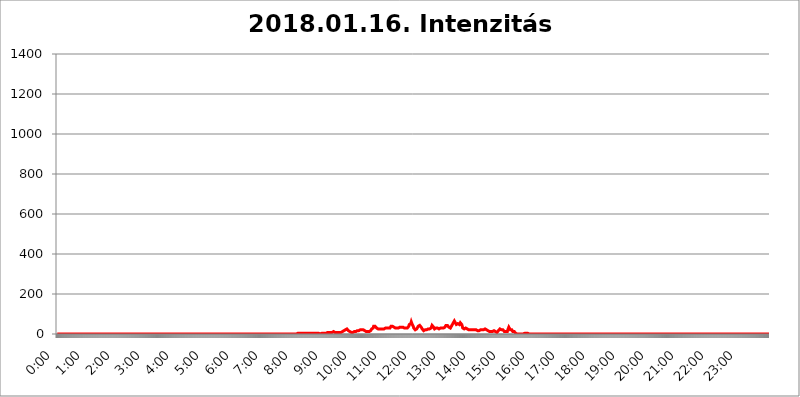
| Category | 2018.01.16. Intenzitás [W/m^2] |
|---|---|
| 0.0 | 0 |
| 0.0006944444444444445 | 0 |
| 0.001388888888888889 | 0 |
| 0.0020833333333333333 | 0 |
| 0.002777777777777778 | 0 |
| 0.003472222222222222 | 0 |
| 0.004166666666666667 | 0 |
| 0.004861111111111111 | 0 |
| 0.005555555555555556 | 0 |
| 0.0062499999999999995 | 0 |
| 0.006944444444444444 | 0 |
| 0.007638888888888889 | 0 |
| 0.008333333333333333 | 0 |
| 0.009027777777777779 | 0 |
| 0.009722222222222222 | 0 |
| 0.010416666666666666 | 0 |
| 0.011111111111111112 | 0 |
| 0.011805555555555555 | 0 |
| 0.012499999999999999 | 0 |
| 0.013194444444444444 | 0 |
| 0.013888888888888888 | 0 |
| 0.014583333333333332 | 0 |
| 0.015277777777777777 | 0 |
| 0.015972222222222224 | 0 |
| 0.016666666666666666 | 0 |
| 0.017361111111111112 | 0 |
| 0.018055555555555557 | 0 |
| 0.01875 | 0 |
| 0.019444444444444445 | 0 |
| 0.02013888888888889 | 0 |
| 0.020833333333333332 | 0 |
| 0.02152777777777778 | 0 |
| 0.022222222222222223 | 0 |
| 0.02291666666666667 | 0 |
| 0.02361111111111111 | 0 |
| 0.024305555555555556 | 0 |
| 0.024999999999999998 | 0 |
| 0.025694444444444447 | 0 |
| 0.02638888888888889 | 0 |
| 0.027083333333333334 | 0 |
| 0.027777777777777776 | 0 |
| 0.02847222222222222 | 0 |
| 0.029166666666666664 | 0 |
| 0.029861111111111113 | 0 |
| 0.030555555555555555 | 0 |
| 0.03125 | 0 |
| 0.03194444444444445 | 0 |
| 0.03263888888888889 | 0 |
| 0.03333333333333333 | 0 |
| 0.034027777777777775 | 0 |
| 0.034722222222222224 | 0 |
| 0.035416666666666666 | 0 |
| 0.036111111111111115 | 0 |
| 0.03680555555555556 | 0 |
| 0.0375 | 0 |
| 0.03819444444444444 | 0 |
| 0.03888888888888889 | 0 |
| 0.03958333333333333 | 0 |
| 0.04027777777777778 | 0 |
| 0.04097222222222222 | 0 |
| 0.041666666666666664 | 0 |
| 0.042361111111111106 | 0 |
| 0.04305555555555556 | 0 |
| 0.043750000000000004 | 0 |
| 0.044444444444444446 | 0 |
| 0.04513888888888889 | 0 |
| 0.04583333333333334 | 0 |
| 0.04652777777777778 | 0 |
| 0.04722222222222222 | 0 |
| 0.04791666666666666 | 0 |
| 0.04861111111111111 | 0 |
| 0.049305555555555554 | 0 |
| 0.049999999999999996 | 0 |
| 0.05069444444444445 | 0 |
| 0.051388888888888894 | 0 |
| 0.052083333333333336 | 0 |
| 0.05277777777777778 | 0 |
| 0.05347222222222222 | 0 |
| 0.05416666666666667 | 0 |
| 0.05486111111111111 | 0 |
| 0.05555555555555555 | 0 |
| 0.05625 | 0 |
| 0.05694444444444444 | 0 |
| 0.057638888888888885 | 0 |
| 0.05833333333333333 | 0 |
| 0.05902777777777778 | 0 |
| 0.059722222222222225 | 0 |
| 0.06041666666666667 | 0 |
| 0.061111111111111116 | 0 |
| 0.06180555555555556 | 0 |
| 0.0625 | 0 |
| 0.06319444444444444 | 0 |
| 0.06388888888888888 | 0 |
| 0.06458333333333334 | 0 |
| 0.06527777777777778 | 0 |
| 0.06597222222222222 | 0 |
| 0.06666666666666667 | 0 |
| 0.06736111111111111 | 0 |
| 0.06805555555555555 | 0 |
| 0.06874999999999999 | 0 |
| 0.06944444444444443 | 0 |
| 0.07013888888888889 | 0 |
| 0.07083333333333333 | 0 |
| 0.07152777777777779 | 0 |
| 0.07222222222222223 | 0 |
| 0.07291666666666667 | 0 |
| 0.07361111111111111 | 0 |
| 0.07430555555555556 | 0 |
| 0.075 | 0 |
| 0.07569444444444444 | 0 |
| 0.0763888888888889 | 0 |
| 0.07708333333333334 | 0 |
| 0.07777777777777778 | 0 |
| 0.07847222222222222 | 0 |
| 0.07916666666666666 | 0 |
| 0.0798611111111111 | 0 |
| 0.08055555555555556 | 0 |
| 0.08125 | 0 |
| 0.08194444444444444 | 0 |
| 0.08263888888888889 | 0 |
| 0.08333333333333333 | 0 |
| 0.08402777777777777 | 0 |
| 0.08472222222222221 | 0 |
| 0.08541666666666665 | 0 |
| 0.08611111111111112 | 0 |
| 0.08680555555555557 | 0 |
| 0.08750000000000001 | 0 |
| 0.08819444444444445 | 0 |
| 0.08888888888888889 | 0 |
| 0.08958333333333333 | 0 |
| 0.09027777777777778 | 0 |
| 0.09097222222222222 | 0 |
| 0.09166666666666667 | 0 |
| 0.09236111111111112 | 0 |
| 0.09305555555555556 | 0 |
| 0.09375 | 0 |
| 0.09444444444444444 | 0 |
| 0.09513888888888888 | 0 |
| 0.09583333333333333 | 0 |
| 0.09652777777777777 | 0 |
| 0.09722222222222222 | 0 |
| 0.09791666666666667 | 0 |
| 0.09861111111111111 | 0 |
| 0.09930555555555555 | 0 |
| 0.09999999999999999 | 0 |
| 0.10069444444444443 | 0 |
| 0.1013888888888889 | 0 |
| 0.10208333333333335 | 0 |
| 0.10277777777777779 | 0 |
| 0.10347222222222223 | 0 |
| 0.10416666666666667 | 0 |
| 0.10486111111111111 | 0 |
| 0.10555555555555556 | 0 |
| 0.10625 | 0 |
| 0.10694444444444444 | 0 |
| 0.1076388888888889 | 0 |
| 0.10833333333333334 | 0 |
| 0.10902777777777778 | 0 |
| 0.10972222222222222 | 0 |
| 0.1111111111111111 | 0 |
| 0.11180555555555556 | 0 |
| 0.11180555555555556 | 0 |
| 0.1125 | 0 |
| 0.11319444444444444 | 0 |
| 0.11388888888888889 | 0 |
| 0.11458333333333333 | 0 |
| 0.11527777777777777 | 0 |
| 0.11597222222222221 | 0 |
| 0.11666666666666665 | 0 |
| 0.1173611111111111 | 0 |
| 0.11805555555555557 | 0 |
| 0.11944444444444445 | 0 |
| 0.12013888888888889 | 0 |
| 0.12083333333333333 | 0 |
| 0.12152777777777778 | 0 |
| 0.12222222222222223 | 0 |
| 0.12291666666666667 | 0 |
| 0.12291666666666667 | 0 |
| 0.12361111111111112 | 0 |
| 0.12430555555555556 | 0 |
| 0.125 | 0 |
| 0.12569444444444444 | 0 |
| 0.12638888888888888 | 0 |
| 0.12708333333333333 | 0 |
| 0.16875 | 0 |
| 0.12847222222222224 | 0 |
| 0.12916666666666668 | 0 |
| 0.12986111111111112 | 0 |
| 0.13055555555555556 | 0 |
| 0.13125 | 0 |
| 0.13194444444444445 | 0 |
| 0.1326388888888889 | 0 |
| 0.13333333333333333 | 0 |
| 0.13402777777777777 | 0 |
| 0.13402777777777777 | 0 |
| 0.13472222222222222 | 0 |
| 0.13541666666666666 | 0 |
| 0.1361111111111111 | 0 |
| 0.13749999999999998 | 0 |
| 0.13819444444444443 | 0 |
| 0.1388888888888889 | 0 |
| 0.13958333333333334 | 0 |
| 0.14027777777777778 | 0 |
| 0.14097222222222222 | 0 |
| 0.14166666666666666 | 0 |
| 0.1423611111111111 | 0 |
| 0.14305555555555557 | 0 |
| 0.14375000000000002 | 0 |
| 0.14444444444444446 | 0 |
| 0.1451388888888889 | 0 |
| 0.1451388888888889 | 0 |
| 0.14652777777777778 | 0 |
| 0.14722222222222223 | 0 |
| 0.14791666666666667 | 0 |
| 0.1486111111111111 | 0 |
| 0.14930555555555555 | 0 |
| 0.15 | 0 |
| 0.15069444444444444 | 0 |
| 0.15138888888888888 | 0 |
| 0.15208333333333332 | 0 |
| 0.15277777777777776 | 0 |
| 0.15347222222222223 | 0 |
| 0.15416666666666667 | 0 |
| 0.15486111111111112 | 0 |
| 0.15555555555555556 | 0 |
| 0.15625 | 0 |
| 0.15694444444444444 | 0 |
| 0.15763888888888888 | 0 |
| 0.15833333333333333 | 0 |
| 0.15902777777777777 | 0 |
| 0.15972222222222224 | 0 |
| 0.16041666666666668 | 0 |
| 0.16111111111111112 | 0 |
| 0.16180555555555556 | 0 |
| 0.1625 | 0 |
| 0.16319444444444445 | 0 |
| 0.1638888888888889 | 0 |
| 0.16458333333333333 | 0 |
| 0.16527777777777777 | 0 |
| 0.16597222222222222 | 0 |
| 0.16666666666666666 | 0 |
| 0.1673611111111111 | 0 |
| 0.16805555555555554 | 0 |
| 0.16874999999999998 | 0 |
| 0.16944444444444443 | 0 |
| 0.17013888888888887 | 0 |
| 0.1708333333333333 | 0 |
| 0.17152777777777775 | 0 |
| 0.17222222222222225 | 0 |
| 0.1729166666666667 | 0 |
| 0.17361111111111113 | 0 |
| 0.17430555555555557 | 0 |
| 0.17500000000000002 | 0 |
| 0.17569444444444446 | 0 |
| 0.1763888888888889 | 0 |
| 0.17708333333333334 | 0 |
| 0.17777777777777778 | 0 |
| 0.17847222222222223 | 0 |
| 0.17916666666666667 | 0 |
| 0.1798611111111111 | 0 |
| 0.18055555555555555 | 0 |
| 0.18125 | 0 |
| 0.18194444444444444 | 0 |
| 0.1826388888888889 | 0 |
| 0.18333333333333335 | 0 |
| 0.1840277777777778 | 0 |
| 0.18472222222222223 | 0 |
| 0.18541666666666667 | 0 |
| 0.18611111111111112 | 0 |
| 0.18680555555555556 | 0 |
| 0.1875 | 0 |
| 0.18819444444444444 | 0 |
| 0.18888888888888888 | 0 |
| 0.18958333333333333 | 0 |
| 0.19027777777777777 | 0 |
| 0.1909722222222222 | 0 |
| 0.19166666666666665 | 0 |
| 0.19236111111111112 | 0 |
| 0.19305555555555554 | 0 |
| 0.19375 | 0 |
| 0.19444444444444445 | 0 |
| 0.1951388888888889 | 0 |
| 0.19583333333333333 | 0 |
| 0.19652777777777777 | 0 |
| 0.19722222222222222 | 0 |
| 0.19791666666666666 | 0 |
| 0.1986111111111111 | 0 |
| 0.19930555555555554 | 0 |
| 0.19999999999999998 | 0 |
| 0.20069444444444443 | 0 |
| 0.20138888888888887 | 0 |
| 0.2020833333333333 | 0 |
| 0.2027777777777778 | 0 |
| 0.2034722222222222 | 0 |
| 0.2041666666666667 | 0 |
| 0.20486111111111113 | 0 |
| 0.20555555555555557 | 0 |
| 0.20625000000000002 | 0 |
| 0.20694444444444446 | 0 |
| 0.2076388888888889 | 0 |
| 0.20833333333333334 | 0 |
| 0.20902777777777778 | 0 |
| 0.20972222222222223 | 0 |
| 0.21041666666666667 | 0 |
| 0.2111111111111111 | 0 |
| 0.21180555555555555 | 0 |
| 0.2125 | 0 |
| 0.21319444444444444 | 0 |
| 0.2138888888888889 | 0 |
| 0.21458333333333335 | 0 |
| 0.2152777777777778 | 0 |
| 0.21597222222222223 | 0 |
| 0.21666666666666667 | 0 |
| 0.21736111111111112 | 0 |
| 0.21805555555555556 | 0 |
| 0.21875 | 0 |
| 0.21944444444444444 | 0 |
| 0.22013888888888888 | 0 |
| 0.22083333333333333 | 0 |
| 0.22152777777777777 | 0 |
| 0.2222222222222222 | 0 |
| 0.22291666666666665 | 0 |
| 0.2236111111111111 | 0 |
| 0.22430555555555556 | 0 |
| 0.225 | 0 |
| 0.22569444444444445 | 0 |
| 0.2263888888888889 | 0 |
| 0.22708333333333333 | 0 |
| 0.22777777777777777 | 0 |
| 0.22847222222222222 | 0 |
| 0.22916666666666666 | 0 |
| 0.2298611111111111 | 0 |
| 0.23055555555555554 | 0 |
| 0.23124999999999998 | 0 |
| 0.23194444444444443 | 0 |
| 0.23263888888888887 | 0 |
| 0.2333333333333333 | 0 |
| 0.2340277777777778 | 0 |
| 0.2347222222222222 | 0 |
| 0.2354166666666667 | 0 |
| 0.23611111111111113 | 0 |
| 0.23680555555555557 | 0 |
| 0.23750000000000002 | 0 |
| 0.23819444444444446 | 0 |
| 0.2388888888888889 | 0 |
| 0.23958333333333334 | 0 |
| 0.24027777777777778 | 0 |
| 0.24097222222222223 | 0 |
| 0.24166666666666667 | 0 |
| 0.2423611111111111 | 0 |
| 0.24305555555555555 | 0 |
| 0.24375 | 0 |
| 0.24444444444444446 | 0 |
| 0.24513888888888888 | 0 |
| 0.24583333333333335 | 0 |
| 0.2465277777777778 | 0 |
| 0.24722222222222223 | 0 |
| 0.24791666666666667 | 0 |
| 0.24861111111111112 | 0 |
| 0.24930555555555556 | 0 |
| 0.25 | 0 |
| 0.25069444444444444 | 0 |
| 0.2513888888888889 | 0 |
| 0.2520833333333333 | 0 |
| 0.25277777777777777 | 0 |
| 0.2534722222222222 | 0 |
| 0.25416666666666665 | 0 |
| 0.2548611111111111 | 0 |
| 0.2555555555555556 | 0 |
| 0.25625000000000003 | 0 |
| 0.2569444444444445 | 0 |
| 0.2576388888888889 | 0 |
| 0.25833333333333336 | 0 |
| 0.2590277777777778 | 0 |
| 0.25972222222222224 | 0 |
| 0.2604166666666667 | 0 |
| 0.2611111111111111 | 0 |
| 0.26180555555555557 | 0 |
| 0.2625 | 0 |
| 0.26319444444444445 | 0 |
| 0.2638888888888889 | 0 |
| 0.26458333333333334 | 0 |
| 0.2652777777777778 | 0 |
| 0.2659722222222222 | 0 |
| 0.26666666666666666 | 0 |
| 0.2673611111111111 | 0 |
| 0.26805555555555555 | 0 |
| 0.26875 | 0 |
| 0.26944444444444443 | 0 |
| 0.2701388888888889 | 0 |
| 0.2708333333333333 | 0 |
| 0.27152777777777776 | 0 |
| 0.2722222222222222 | 0 |
| 0.27291666666666664 | 0 |
| 0.2736111111111111 | 0 |
| 0.2743055555555555 | 0 |
| 0.27499999999999997 | 0 |
| 0.27569444444444446 | 0 |
| 0.27638888888888885 | 0 |
| 0.27708333333333335 | 0 |
| 0.2777777777777778 | 0 |
| 0.27847222222222223 | 0 |
| 0.2791666666666667 | 0 |
| 0.2798611111111111 | 0 |
| 0.28055555555555556 | 0 |
| 0.28125 | 0 |
| 0.28194444444444444 | 0 |
| 0.2826388888888889 | 0 |
| 0.2833333333333333 | 0 |
| 0.28402777777777777 | 0 |
| 0.2847222222222222 | 0 |
| 0.28541666666666665 | 0 |
| 0.28611111111111115 | 0 |
| 0.28680555555555554 | 0 |
| 0.28750000000000003 | 0 |
| 0.2881944444444445 | 0 |
| 0.2888888888888889 | 0 |
| 0.28958333333333336 | 0 |
| 0.2902777777777778 | 0 |
| 0.29097222222222224 | 0 |
| 0.2916666666666667 | 0 |
| 0.2923611111111111 | 0 |
| 0.29305555555555557 | 0 |
| 0.29375 | 0 |
| 0.29444444444444445 | 0 |
| 0.2951388888888889 | 0 |
| 0.29583333333333334 | 0 |
| 0.2965277777777778 | 0 |
| 0.2972222222222222 | 0 |
| 0.29791666666666666 | 0 |
| 0.2986111111111111 | 0 |
| 0.29930555555555555 | 0 |
| 0.3 | 0 |
| 0.30069444444444443 | 0 |
| 0.3013888888888889 | 0 |
| 0.3020833333333333 | 0 |
| 0.30277777777777776 | 0 |
| 0.3034722222222222 | 0 |
| 0.30416666666666664 | 0 |
| 0.3048611111111111 | 0 |
| 0.3055555555555555 | 0 |
| 0.30624999999999997 | 0 |
| 0.3069444444444444 | 0 |
| 0.3076388888888889 | 0 |
| 0.30833333333333335 | 0 |
| 0.3090277777777778 | 0 |
| 0.30972222222222223 | 0 |
| 0.3104166666666667 | 0 |
| 0.3111111111111111 | 0 |
| 0.31180555555555556 | 0 |
| 0.3125 | 0 |
| 0.31319444444444444 | 0 |
| 0.3138888888888889 | 0 |
| 0.3145833333333333 | 0 |
| 0.31527777777777777 | 0 |
| 0.3159722222222222 | 0 |
| 0.31666666666666665 | 0 |
| 0.31736111111111115 | 0 |
| 0.31805555555555554 | 0 |
| 0.31875000000000003 | 0 |
| 0.3194444444444445 | 0 |
| 0.3201388888888889 | 0 |
| 0.32083333333333336 | 0 |
| 0.3215277777777778 | 0 |
| 0.32222222222222224 | 0 |
| 0.3229166666666667 | 0 |
| 0.3236111111111111 | 0 |
| 0.32430555555555557 | 0 |
| 0.325 | 0 |
| 0.32569444444444445 | 0 |
| 0.3263888888888889 | 0 |
| 0.32708333333333334 | 0 |
| 0.3277777777777778 | 0 |
| 0.3284722222222222 | 0 |
| 0.32916666666666666 | 0 |
| 0.3298611111111111 | 0 |
| 0.33055555555555555 | 0 |
| 0.33125 | 0 |
| 0.33194444444444443 | 0 |
| 0.3326388888888889 | 0 |
| 0.3333333333333333 | 0 |
| 0.3340277777777778 | 0 |
| 0.3347222222222222 | 0 |
| 0.3354166666666667 | 0 |
| 0.3361111111111111 | 3.525 |
| 0.3368055555555556 | 3.525 |
| 0.33749999999999997 | 3.525 |
| 0.33819444444444446 | 3.525 |
| 0.33888888888888885 | 3.525 |
| 0.33958333333333335 | 3.525 |
| 0.34027777777777773 | 3.525 |
| 0.34097222222222223 | 3.525 |
| 0.3416666666666666 | 3.525 |
| 0.3423611111111111 | 3.525 |
| 0.3430555555555555 | 3.525 |
| 0.34375 | 3.525 |
| 0.3444444444444445 | 3.525 |
| 0.3451388888888889 | 3.525 |
| 0.3458333333333334 | 3.525 |
| 0.34652777777777777 | 3.525 |
| 0.34722222222222227 | 3.525 |
| 0.34791666666666665 | 3.525 |
| 0.34861111111111115 | 3.525 |
| 0.34930555555555554 | 3.525 |
| 0.35000000000000003 | 3.525 |
| 0.3506944444444444 | 3.525 |
| 0.3513888888888889 | 3.525 |
| 0.3520833333333333 | 3.525 |
| 0.3527777777777778 | 3.525 |
| 0.3534722222222222 | 3.525 |
| 0.3541666666666667 | 3.525 |
| 0.3548611111111111 | 3.525 |
| 0.35555555555555557 | 3.525 |
| 0.35625 | 3.525 |
| 0.35694444444444445 | 3.525 |
| 0.3576388888888889 | 3.525 |
| 0.35833333333333334 | 3.525 |
| 0.3590277777777778 | 7.887 |
| 0.3597222222222222 | 7.887 |
| 0.36041666666666666 | 3.525 |
| 0.3611111111111111 | 7.887 |
| 0.36180555555555555 | 3.525 |
| 0.3625 | 3.525 |
| 0.36319444444444443 | 3.525 |
| 0.3638888888888889 | 3.525 |
| 0.3645833333333333 | 3.525 |
| 0.3652777777777778 | 3.525 |
| 0.3659722222222222 | 3.525 |
| 0.3666666666666667 | 3.525 |
| 0.3673611111111111 | 3.525 |
| 0.3680555555555556 | 3.525 |
| 0.36874999999999997 | 0 |
| 0.36944444444444446 | 3.525 |
| 0.37013888888888885 | 3.525 |
| 0.37083333333333335 | 3.525 |
| 0.37152777777777773 | 3.525 |
| 0.37222222222222223 | 3.525 |
| 0.3729166666666666 | 3.525 |
| 0.3736111111111111 | 3.525 |
| 0.3743055555555555 | 3.525 |
| 0.375 | 3.525 |
| 0.3756944444444445 | 3.525 |
| 0.3763888888888889 | 3.525 |
| 0.3770833333333334 | 3.525 |
| 0.37777777777777777 | 3.525 |
| 0.37847222222222227 | 3.525 |
| 0.37916666666666665 | 7.887 |
| 0.37986111111111115 | 7.887 |
| 0.38055555555555554 | 7.887 |
| 0.38125000000000003 | 7.887 |
| 0.3819444444444444 | 7.887 |
| 0.3826388888888889 | 7.887 |
| 0.3833333333333333 | 7.887 |
| 0.3840277777777778 | 7.887 |
| 0.3847222222222222 | 7.887 |
| 0.3854166666666667 | 7.887 |
| 0.3861111111111111 | 12.257 |
| 0.38680555555555557 | 12.257 |
| 0.3875 | 12.257 |
| 0.38819444444444445 | 12.257 |
| 0.3888888888888889 | 7.887 |
| 0.38958333333333334 | 7.887 |
| 0.3902777777777778 | 12.257 |
| 0.3909722222222222 | 12.257 |
| 0.39166666666666666 | 7.887 |
| 0.3923611111111111 | 7.887 |
| 0.39305555555555555 | 7.887 |
| 0.39375 | 7.887 |
| 0.39444444444444443 | 7.887 |
| 0.3951388888888889 | 7.887 |
| 0.3958333333333333 | 7.887 |
| 0.3965277777777778 | 7.887 |
| 0.3972222222222222 | 7.887 |
| 0.3979166666666667 | 7.887 |
| 0.3986111111111111 | 7.887 |
| 0.3993055555555556 | 7.887 |
| 0.39999999999999997 | 12.257 |
| 0.40069444444444446 | 12.257 |
| 0.40138888888888885 | 12.257 |
| 0.40208333333333335 | 16.636 |
| 0.40277777777777773 | 21.024 |
| 0.40347222222222223 | 21.024 |
| 0.4041666666666666 | 21.024 |
| 0.4048611111111111 | 25.419 |
| 0.4055555555555555 | 25.419 |
| 0.40625 | 25.419 |
| 0.4069444444444445 | 21.024 |
| 0.4076388888888889 | 21.024 |
| 0.4083333333333334 | 16.636 |
| 0.40902777777777777 | 12.257 |
| 0.40972222222222227 | 12.257 |
| 0.41041666666666665 | 12.257 |
| 0.41111111111111115 | 12.257 |
| 0.41180555555555554 | 7.887 |
| 0.41250000000000003 | 7.887 |
| 0.4131944444444444 | 7.887 |
| 0.4138888888888889 | 7.887 |
| 0.4145833333333333 | 7.887 |
| 0.4152777777777778 | 12.257 |
| 0.4159722222222222 | 12.257 |
| 0.4166666666666667 | 12.257 |
| 0.4173611111111111 | 12.257 |
| 0.41805555555555557 | 12.257 |
| 0.41875 | 12.257 |
| 0.41944444444444445 | 12.257 |
| 0.4201388888888889 | 12.257 |
| 0.42083333333333334 | 16.636 |
| 0.4215277777777778 | 16.636 |
| 0.4222222222222222 | 16.636 |
| 0.42291666666666666 | 16.636 |
| 0.4236111111111111 | 16.636 |
| 0.42430555555555555 | 21.024 |
| 0.425 | 21.024 |
| 0.42569444444444443 | 21.024 |
| 0.4263888888888889 | 21.024 |
| 0.4270833333333333 | 21.024 |
| 0.4277777777777778 | 21.024 |
| 0.4284722222222222 | 21.024 |
| 0.4291666666666667 | 21.024 |
| 0.4298611111111111 | 21.024 |
| 0.4305555555555556 | 21.024 |
| 0.43124999999999997 | 16.636 |
| 0.43194444444444446 | 16.636 |
| 0.43263888888888885 | 12.257 |
| 0.43333333333333335 | 12.257 |
| 0.43402777777777773 | 12.257 |
| 0.43472222222222223 | 12.257 |
| 0.4354166666666666 | 12.257 |
| 0.4361111111111111 | 12.257 |
| 0.4368055555555555 | 12.257 |
| 0.4375 | 12.257 |
| 0.4381944444444445 | 12.257 |
| 0.4388888888888889 | 12.257 |
| 0.4395833333333334 | 16.636 |
| 0.44027777777777777 | 21.024 |
| 0.44097222222222227 | 25.419 |
| 0.44166666666666665 | 29.823 |
| 0.44236111111111115 | 29.823 |
| 0.44305555555555554 | 29.823 |
| 0.44375000000000003 | 38.653 |
| 0.4444444444444444 | 43.079 |
| 0.4451388888888889 | 43.079 |
| 0.4458333333333333 | 38.653 |
| 0.4465277777777778 | 34.234 |
| 0.4472222222222222 | 34.234 |
| 0.4479166666666667 | 29.823 |
| 0.4486111111111111 | 29.823 |
| 0.44930555555555557 | 29.823 |
| 0.45 | 25.419 |
| 0.45069444444444445 | 25.419 |
| 0.4513888888888889 | 25.419 |
| 0.45208333333333334 | 25.419 |
| 0.4527777777777778 | 25.419 |
| 0.4534722222222222 | 25.419 |
| 0.45416666666666666 | 25.419 |
| 0.4548611111111111 | 25.419 |
| 0.45555555555555555 | 21.024 |
| 0.45625 | 25.419 |
| 0.45694444444444443 | 25.419 |
| 0.4576388888888889 | 25.419 |
| 0.4583333333333333 | 25.419 |
| 0.4590277777777778 | 25.419 |
| 0.4597222222222222 | 25.419 |
| 0.4604166666666667 | 29.823 |
| 0.4611111111111111 | 29.823 |
| 0.4618055555555556 | 29.823 |
| 0.46249999999999997 | 29.823 |
| 0.46319444444444446 | 29.823 |
| 0.46388888888888885 | 29.823 |
| 0.46458333333333335 | 29.823 |
| 0.46527777777777773 | 29.823 |
| 0.46597222222222223 | 29.823 |
| 0.4666666666666666 | 29.823 |
| 0.4673611111111111 | 34.234 |
| 0.4680555555555555 | 38.653 |
| 0.46875 | 34.234 |
| 0.4694444444444445 | 34.234 |
| 0.4701388888888889 | 38.653 |
| 0.4708333333333334 | 34.234 |
| 0.47152777777777777 | 34.234 |
| 0.47222222222222227 | 34.234 |
| 0.47291666666666665 | 34.234 |
| 0.47361111111111115 | 29.823 |
| 0.47430555555555554 | 29.823 |
| 0.47500000000000003 | 29.823 |
| 0.4756944444444444 | 29.823 |
| 0.4763888888888889 | 29.823 |
| 0.4770833333333333 | 29.823 |
| 0.4777777777777778 | 29.823 |
| 0.4784722222222222 | 29.823 |
| 0.4791666666666667 | 29.823 |
| 0.4798611111111111 | 29.823 |
| 0.48055555555555557 | 34.234 |
| 0.48125 | 34.234 |
| 0.48194444444444445 | 34.234 |
| 0.4826388888888889 | 34.234 |
| 0.48333333333333334 | 34.234 |
| 0.4840277777777778 | 34.234 |
| 0.4847222222222222 | 34.234 |
| 0.48541666666666666 | 34.234 |
| 0.4861111111111111 | 29.823 |
| 0.48680555555555555 | 29.823 |
| 0.4875 | 29.823 |
| 0.48819444444444443 | 29.823 |
| 0.4888888888888889 | 29.823 |
| 0.4895833333333333 | 29.823 |
| 0.4902777777777778 | 29.823 |
| 0.4909722222222222 | 29.823 |
| 0.4916666666666667 | 34.234 |
| 0.4923611111111111 | 34.234 |
| 0.4930555555555556 | 38.653 |
| 0.49374999999999997 | 47.511 |
| 0.49444444444444446 | 51.951 |
| 0.49513888888888885 | 43.079 |
| 0.49583333333333335 | 51.951 |
| 0.49652777777777773 | 60.85 |
| 0.49722222222222223 | 56.398 |
| 0.4979166666666666 | 47.511 |
| 0.4986111111111111 | 43.079 |
| 0.4993055555555555 | 38.653 |
| 0.5 | 29.823 |
| 0.5006944444444444 | 29.823 |
| 0.5013888888888889 | 25.419 |
| 0.5020833333333333 | 21.024 |
| 0.5027777777777778 | 21.024 |
| 0.5034722222222222 | 16.636 |
| 0.5041666666666667 | 25.419 |
| 0.5048611111111111 | 29.823 |
| 0.5055555555555555 | 29.823 |
| 0.50625 | 38.653 |
| 0.5069444444444444 | 38.653 |
| 0.5076388888888889 | 43.079 |
| 0.5083333333333333 | 43.079 |
| 0.5090277777777777 | 47.511 |
| 0.5097222222222222 | 47.511 |
| 0.5104166666666666 | 34.234 |
| 0.5111111111111112 | 29.823 |
| 0.5118055555555555 | 25.419 |
| 0.5125000000000001 | 21.024 |
| 0.5131944444444444 | 21.024 |
| 0.513888888888889 | 16.636 |
| 0.5145833333333333 | 12.257 |
| 0.5152777777777778 | 16.636 |
| 0.5159722222222222 | 21.024 |
| 0.5166666666666667 | 21.024 |
| 0.517361111111111 | 25.419 |
| 0.5180555555555556 | 21.024 |
| 0.5187499999999999 | 21.024 |
| 0.5194444444444445 | 21.024 |
| 0.5201388888888888 | 25.419 |
| 0.5208333333333334 | 25.419 |
| 0.5215277777777778 | 25.419 |
| 0.5222222222222223 | 25.419 |
| 0.5229166666666667 | 29.823 |
| 0.5236111111111111 | 29.823 |
| 0.5243055555555556 | 29.823 |
| 0.525 | 34.234 |
| 0.5256944444444445 | 43.079 |
| 0.5263888888888889 | 47.511 |
| 0.5270833333333333 | 38.653 |
| 0.5277777777777778 | 34.234 |
| 0.5284722222222222 | 29.823 |
| 0.5291666666666667 | 25.419 |
| 0.5298611111111111 | 29.823 |
| 0.5305555555555556 | 29.823 |
| 0.53125 | 29.823 |
| 0.5319444444444444 | 29.823 |
| 0.5326388888888889 | 29.823 |
| 0.5333333333333333 | 29.823 |
| 0.5340277777777778 | 29.823 |
| 0.5347222222222222 | 25.419 |
| 0.5354166666666667 | 25.419 |
| 0.5361111111111111 | 29.823 |
| 0.5368055555555555 | 29.823 |
| 0.5375 | 29.823 |
| 0.5381944444444444 | 29.823 |
| 0.5388888888888889 | 29.823 |
| 0.5395833333333333 | 29.823 |
| 0.5402777777777777 | 29.823 |
| 0.5409722222222222 | 29.823 |
| 0.5416666666666666 | 29.823 |
| 0.5423611111111112 | 29.823 |
| 0.5430555555555555 | 29.823 |
| 0.5437500000000001 | 34.234 |
| 0.5444444444444444 | 38.653 |
| 0.545138888888889 | 43.079 |
| 0.5458333333333333 | 43.079 |
| 0.5465277777777778 | 43.079 |
| 0.5472222222222222 | 43.079 |
| 0.5479166666666667 | 43.079 |
| 0.548611111111111 | 38.653 |
| 0.5493055555555556 | 34.234 |
| 0.5499999999999999 | 29.823 |
| 0.5506944444444445 | 29.823 |
| 0.5513888888888888 | 29.823 |
| 0.5520833333333334 | 34.234 |
| 0.5527777777777778 | 38.653 |
| 0.5534722222222223 | 38.653 |
| 0.5541666666666667 | 47.511 |
| 0.5548611111111111 | 47.511 |
| 0.5555555555555556 | 56.398 |
| 0.55625 | 60.85 |
| 0.5569444444444445 | 65.31 |
| 0.5576388888888889 | 60.85 |
| 0.5583333333333333 | 56.398 |
| 0.5590277777777778 | 51.951 |
| 0.5597222222222222 | 47.511 |
| 0.5604166666666667 | 43.079 |
| 0.5611111111111111 | 47.511 |
| 0.5618055555555556 | 51.951 |
| 0.5625 | 56.398 |
| 0.5631944444444444 | 51.951 |
| 0.5638888888888889 | 47.511 |
| 0.5645833333333333 | 51.951 |
| 0.5652777777777778 | 56.398 |
| 0.5659722222222222 | 51.951 |
| 0.5666666666666667 | 51.951 |
| 0.5673611111111111 | 47.511 |
| 0.5680555555555555 | 43.079 |
| 0.56875 | 29.823 |
| 0.5694444444444444 | 25.419 |
| 0.5701388888888889 | 25.419 |
| 0.5708333333333333 | 25.419 |
| 0.5715277777777777 | 25.419 |
| 0.5722222222222222 | 29.823 |
| 0.5729166666666666 | 29.823 |
| 0.5736111111111112 | 25.419 |
| 0.5743055555555555 | 25.419 |
| 0.5750000000000001 | 25.419 |
| 0.5756944444444444 | 21.024 |
| 0.576388888888889 | 21.024 |
| 0.5770833333333333 | 21.024 |
| 0.5777777777777778 | 21.024 |
| 0.5784722222222222 | 21.024 |
| 0.5791666666666667 | 21.024 |
| 0.579861111111111 | 21.024 |
| 0.5805555555555556 | 21.024 |
| 0.5812499999999999 | 21.024 |
| 0.5819444444444445 | 21.024 |
| 0.5826388888888888 | 21.024 |
| 0.5833333333333334 | 21.024 |
| 0.5840277777777778 | 21.024 |
| 0.5847222222222223 | 21.024 |
| 0.5854166666666667 | 21.024 |
| 0.5861111111111111 | 21.024 |
| 0.5868055555555556 | 21.024 |
| 0.5875 | 21.024 |
| 0.5881944444444445 | 21.024 |
| 0.5888888888888889 | 16.636 |
| 0.5895833333333333 | 16.636 |
| 0.5902777777777778 | 16.636 |
| 0.5909722222222222 | 16.636 |
| 0.5916666666666667 | 16.636 |
| 0.5923611111111111 | 16.636 |
| 0.5930555555555556 | 21.024 |
| 0.59375 | 21.024 |
| 0.5944444444444444 | 21.024 |
| 0.5951388888888889 | 25.419 |
| 0.5958333333333333 | 21.024 |
| 0.5965277777777778 | 25.419 |
| 0.5972222222222222 | 21.024 |
| 0.5979166666666667 | 21.024 |
| 0.5986111111111111 | 21.024 |
| 0.5993055555555555 | 21.024 |
| 0.6 | 25.419 |
| 0.6006944444444444 | 21.024 |
| 0.6013888888888889 | 21.024 |
| 0.6020833333333333 | 21.024 |
| 0.6027777777777777 | 16.636 |
| 0.6034722222222222 | 16.636 |
| 0.6041666666666666 | 16.636 |
| 0.6048611111111112 | 12.257 |
| 0.6055555555555555 | 12.257 |
| 0.6062500000000001 | 12.257 |
| 0.6069444444444444 | 12.257 |
| 0.607638888888889 | 12.257 |
| 0.6083333333333333 | 12.257 |
| 0.6090277777777778 | 12.257 |
| 0.6097222222222222 | 12.257 |
| 0.6104166666666667 | 12.257 |
| 0.611111111111111 | 16.636 |
| 0.6118055555555556 | 16.636 |
| 0.6124999999999999 | 16.636 |
| 0.6131944444444445 | 12.257 |
| 0.6138888888888888 | 12.257 |
| 0.6145833333333334 | 12.257 |
| 0.6152777777777778 | 7.887 |
| 0.6159722222222223 | 7.887 |
| 0.6166666666666667 | 7.887 |
| 0.6173611111111111 | 12.257 |
| 0.6180555555555556 | 12.257 |
| 0.61875 | 16.636 |
| 0.6194444444444445 | 21.024 |
| 0.6201388888888889 | 21.024 |
| 0.6208333333333333 | 25.419 |
| 0.6215277777777778 | 25.419 |
| 0.6222222222222222 | 21.024 |
| 0.6229166666666667 | 21.024 |
| 0.6236111111111111 | 21.024 |
| 0.6243055555555556 | 21.024 |
| 0.625 | 21.024 |
| 0.6256944444444444 | 21.024 |
| 0.6263888888888889 | 16.636 |
| 0.6270833333333333 | 12.257 |
| 0.6277777777777778 | 12.257 |
| 0.6284722222222222 | 12.257 |
| 0.6291666666666667 | 12.257 |
| 0.6298611111111111 | 12.257 |
| 0.6305555555555555 | 12.257 |
| 0.63125 | 12.257 |
| 0.6319444444444444 | 21.024 |
| 0.6326388888888889 | 25.419 |
| 0.6333333333333333 | 34.234 |
| 0.6340277777777777 | 29.823 |
| 0.6347222222222222 | 29.823 |
| 0.6354166666666666 | 21.024 |
| 0.6361111111111112 | 21.024 |
| 0.6368055555555555 | 25.419 |
| 0.6375000000000001 | 21.024 |
| 0.6381944444444444 | 16.636 |
| 0.638888888888889 | 12.257 |
| 0.6395833333333333 | 12.257 |
| 0.6402777777777778 | 12.257 |
| 0.6409722222222222 | 12.257 |
| 0.6416666666666667 | 7.887 |
| 0.642361111111111 | 7.887 |
| 0.6430555555555556 | 3.525 |
| 0.6437499999999999 | 3.525 |
| 0.6444444444444445 | 3.525 |
| 0.6451388888888888 | 0 |
| 0.6458333333333334 | 0 |
| 0.6465277777777778 | 0 |
| 0.6472222222222223 | 0 |
| 0.6479166666666667 | 0 |
| 0.6486111111111111 | 0 |
| 0.6493055555555556 | 0 |
| 0.65 | 0 |
| 0.6506944444444445 | 0 |
| 0.6513888888888889 | 0 |
| 0.6520833333333333 | 0 |
| 0.6527777777777778 | 0 |
| 0.6534722222222222 | 0 |
| 0.6541666666666667 | 3.525 |
| 0.6548611111111111 | 3.525 |
| 0.6555555555555556 | 3.525 |
| 0.65625 | 3.525 |
| 0.6569444444444444 | 3.525 |
| 0.6576388888888889 | 3.525 |
| 0.6583333333333333 | 3.525 |
| 0.6590277777777778 | 3.525 |
| 0.6597222222222222 | 3.525 |
| 0.6604166666666667 | 0 |
| 0.6611111111111111 | 0 |
| 0.6618055555555555 | 0 |
| 0.6625 | 0 |
| 0.6631944444444444 | 0 |
| 0.6638888888888889 | 0 |
| 0.6645833333333333 | 0 |
| 0.6652777777777777 | 0 |
| 0.6659722222222222 | 0 |
| 0.6666666666666666 | 0 |
| 0.6673611111111111 | 0 |
| 0.6680555555555556 | 0 |
| 0.6687500000000001 | 0 |
| 0.6694444444444444 | 0 |
| 0.6701388888888888 | 0 |
| 0.6708333333333334 | 0 |
| 0.6715277777777778 | 0 |
| 0.6722222222222222 | 0 |
| 0.6729166666666666 | 0 |
| 0.6736111111111112 | 0 |
| 0.6743055555555556 | 0 |
| 0.6749999999999999 | 0 |
| 0.6756944444444444 | 0 |
| 0.6763888888888889 | 0 |
| 0.6770833333333334 | 0 |
| 0.6777777777777777 | 0 |
| 0.6784722222222223 | 0 |
| 0.6791666666666667 | 0 |
| 0.6798611111111111 | 0 |
| 0.6805555555555555 | 0 |
| 0.68125 | 0 |
| 0.6819444444444445 | 0 |
| 0.6826388888888889 | 0 |
| 0.6833333333333332 | 0 |
| 0.6840277777777778 | 0 |
| 0.6847222222222222 | 0 |
| 0.6854166666666667 | 0 |
| 0.686111111111111 | 0 |
| 0.6868055555555556 | 0 |
| 0.6875 | 0 |
| 0.6881944444444444 | 0 |
| 0.688888888888889 | 0 |
| 0.6895833333333333 | 0 |
| 0.6902777777777778 | 0 |
| 0.6909722222222222 | 0 |
| 0.6916666666666668 | 0 |
| 0.6923611111111111 | 0 |
| 0.6930555555555555 | 0 |
| 0.69375 | 0 |
| 0.6944444444444445 | 0 |
| 0.6951388888888889 | 0 |
| 0.6958333333333333 | 0 |
| 0.6965277777777777 | 0 |
| 0.6972222222222223 | 0 |
| 0.6979166666666666 | 0 |
| 0.6986111111111111 | 0 |
| 0.6993055555555556 | 0 |
| 0.7000000000000001 | 0 |
| 0.7006944444444444 | 0 |
| 0.7013888888888888 | 0 |
| 0.7020833333333334 | 0 |
| 0.7027777777777778 | 0 |
| 0.7034722222222222 | 0 |
| 0.7041666666666666 | 0 |
| 0.7048611111111112 | 0 |
| 0.7055555555555556 | 0 |
| 0.7062499999999999 | 0 |
| 0.7069444444444444 | 0 |
| 0.7076388888888889 | 0 |
| 0.7083333333333334 | 0 |
| 0.7090277777777777 | 0 |
| 0.7097222222222223 | 0 |
| 0.7104166666666667 | 0 |
| 0.7111111111111111 | 0 |
| 0.7118055555555555 | 0 |
| 0.7125 | 0 |
| 0.7131944444444445 | 0 |
| 0.7138888888888889 | 0 |
| 0.7145833333333332 | 0 |
| 0.7152777777777778 | 0 |
| 0.7159722222222222 | 0 |
| 0.7166666666666667 | 0 |
| 0.717361111111111 | 0 |
| 0.7180555555555556 | 0 |
| 0.71875 | 0 |
| 0.7194444444444444 | 0 |
| 0.720138888888889 | 0 |
| 0.7208333333333333 | 0 |
| 0.7215277777777778 | 0 |
| 0.7222222222222222 | 0 |
| 0.7229166666666668 | 0 |
| 0.7236111111111111 | 0 |
| 0.7243055555555555 | 0 |
| 0.725 | 0 |
| 0.7256944444444445 | 0 |
| 0.7263888888888889 | 0 |
| 0.7270833333333333 | 0 |
| 0.7277777777777777 | 0 |
| 0.7284722222222223 | 0 |
| 0.7291666666666666 | 0 |
| 0.7298611111111111 | 0 |
| 0.7305555555555556 | 0 |
| 0.7312500000000001 | 0 |
| 0.7319444444444444 | 0 |
| 0.7326388888888888 | 0 |
| 0.7333333333333334 | 0 |
| 0.7340277777777778 | 0 |
| 0.7347222222222222 | 0 |
| 0.7354166666666666 | 0 |
| 0.7361111111111112 | 0 |
| 0.7368055555555556 | 0 |
| 0.7374999999999999 | 0 |
| 0.7381944444444444 | 0 |
| 0.7388888888888889 | 0 |
| 0.7395833333333334 | 0 |
| 0.7402777777777777 | 0 |
| 0.7409722222222223 | 0 |
| 0.7416666666666667 | 0 |
| 0.7423611111111111 | 0 |
| 0.7430555555555555 | 0 |
| 0.74375 | 0 |
| 0.7444444444444445 | 0 |
| 0.7451388888888889 | 0 |
| 0.7458333333333332 | 0 |
| 0.7465277777777778 | 0 |
| 0.7472222222222222 | 0 |
| 0.7479166666666667 | 0 |
| 0.748611111111111 | 0 |
| 0.7493055555555556 | 0 |
| 0.75 | 0 |
| 0.7506944444444444 | 0 |
| 0.751388888888889 | 0 |
| 0.7520833333333333 | 0 |
| 0.7527777777777778 | 0 |
| 0.7534722222222222 | 0 |
| 0.7541666666666668 | 0 |
| 0.7548611111111111 | 0 |
| 0.7555555555555555 | 0 |
| 0.75625 | 0 |
| 0.7569444444444445 | 0 |
| 0.7576388888888889 | 0 |
| 0.7583333333333333 | 0 |
| 0.7590277777777777 | 0 |
| 0.7597222222222223 | 0 |
| 0.7604166666666666 | 0 |
| 0.7611111111111111 | 0 |
| 0.7618055555555556 | 0 |
| 0.7625000000000001 | 0 |
| 0.7631944444444444 | 0 |
| 0.7638888888888888 | 0 |
| 0.7645833333333334 | 0 |
| 0.7652777777777778 | 0 |
| 0.7659722222222222 | 0 |
| 0.7666666666666666 | 0 |
| 0.7673611111111112 | 0 |
| 0.7680555555555556 | 0 |
| 0.7687499999999999 | 0 |
| 0.7694444444444444 | 0 |
| 0.7701388888888889 | 0 |
| 0.7708333333333334 | 0 |
| 0.7715277777777777 | 0 |
| 0.7722222222222223 | 0 |
| 0.7729166666666667 | 0 |
| 0.7736111111111111 | 0 |
| 0.7743055555555555 | 0 |
| 0.775 | 0 |
| 0.7756944444444445 | 0 |
| 0.7763888888888889 | 0 |
| 0.7770833333333332 | 0 |
| 0.7777777777777778 | 0 |
| 0.7784722222222222 | 0 |
| 0.7791666666666667 | 0 |
| 0.779861111111111 | 0 |
| 0.7805555555555556 | 0 |
| 0.78125 | 0 |
| 0.7819444444444444 | 0 |
| 0.782638888888889 | 0 |
| 0.7833333333333333 | 0 |
| 0.7840277777777778 | 0 |
| 0.7847222222222222 | 0 |
| 0.7854166666666668 | 0 |
| 0.7861111111111111 | 0 |
| 0.7868055555555555 | 0 |
| 0.7875 | 0 |
| 0.7881944444444445 | 0 |
| 0.7888888888888889 | 0 |
| 0.7895833333333333 | 0 |
| 0.7902777777777777 | 0 |
| 0.7909722222222223 | 0 |
| 0.7916666666666666 | 0 |
| 0.7923611111111111 | 0 |
| 0.7930555555555556 | 0 |
| 0.7937500000000001 | 0 |
| 0.7944444444444444 | 0 |
| 0.7951388888888888 | 0 |
| 0.7958333333333334 | 0 |
| 0.7965277777777778 | 0 |
| 0.7972222222222222 | 0 |
| 0.7979166666666666 | 0 |
| 0.7986111111111112 | 0 |
| 0.7993055555555556 | 0 |
| 0.7999999999999999 | 0 |
| 0.8006944444444444 | 0 |
| 0.8013888888888889 | 0 |
| 0.8020833333333334 | 0 |
| 0.8027777777777777 | 0 |
| 0.8034722222222223 | 0 |
| 0.8041666666666667 | 0 |
| 0.8048611111111111 | 0 |
| 0.8055555555555555 | 0 |
| 0.80625 | 0 |
| 0.8069444444444445 | 0 |
| 0.8076388888888889 | 0 |
| 0.8083333333333332 | 0 |
| 0.8090277777777778 | 0 |
| 0.8097222222222222 | 0 |
| 0.8104166666666667 | 0 |
| 0.811111111111111 | 0 |
| 0.8118055555555556 | 0 |
| 0.8125 | 0 |
| 0.8131944444444444 | 0 |
| 0.813888888888889 | 0 |
| 0.8145833333333333 | 0 |
| 0.8152777777777778 | 0 |
| 0.8159722222222222 | 0 |
| 0.8166666666666668 | 0 |
| 0.8173611111111111 | 0 |
| 0.8180555555555555 | 0 |
| 0.81875 | 0 |
| 0.8194444444444445 | 0 |
| 0.8201388888888889 | 0 |
| 0.8208333333333333 | 0 |
| 0.8215277777777777 | 0 |
| 0.8222222222222223 | 0 |
| 0.8229166666666666 | 0 |
| 0.8236111111111111 | 0 |
| 0.8243055555555556 | 0 |
| 0.8250000000000001 | 0 |
| 0.8256944444444444 | 0 |
| 0.8263888888888888 | 0 |
| 0.8270833333333334 | 0 |
| 0.8277777777777778 | 0 |
| 0.8284722222222222 | 0 |
| 0.8291666666666666 | 0 |
| 0.8298611111111112 | 0 |
| 0.8305555555555556 | 0 |
| 0.8312499999999999 | 0 |
| 0.8319444444444444 | 0 |
| 0.8326388888888889 | 0 |
| 0.8333333333333334 | 0 |
| 0.8340277777777777 | 0 |
| 0.8347222222222223 | 0 |
| 0.8354166666666667 | 0 |
| 0.8361111111111111 | 0 |
| 0.8368055555555555 | 0 |
| 0.8375 | 0 |
| 0.8381944444444445 | 0 |
| 0.8388888888888889 | 0 |
| 0.8395833333333332 | 0 |
| 0.8402777777777778 | 0 |
| 0.8409722222222222 | 0 |
| 0.8416666666666667 | 0 |
| 0.842361111111111 | 0 |
| 0.8430555555555556 | 0 |
| 0.84375 | 0 |
| 0.8444444444444444 | 0 |
| 0.845138888888889 | 0 |
| 0.8458333333333333 | 0 |
| 0.8465277777777778 | 0 |
| 0.8472222222222222 | 0 |
| 0.8479166666666668 | 0 |
| 0.8486111111111111 | 0 |
| 0.8493055555555555 | 0 |
| 0.85 | 0 |
| 0.8506944444444445 | 0 |
| 0.8513888888888889 | 0 |
| 0.8520833333333333 | 0 |
| 0.8527777777777777 | 0 |
| 0.8534722222222223 | 0 |
| 0.8541666666666666 | 0 |
| 0.8548611111111111 | 0 |
| 0.8555555555555556 | 0 |
| 0.8562500000000001 | 0 |
| 0.8569444444444444 | 0 |
| 0.8576388888888888 | 0 |
| 0.8583333333333334 | 0 |
| 0.8590277777777778 | 0 |
| 0.8597222222222222 | 0 |
| 0.8604166666666666 | 0 |
| 0.8611111111111112 | 0 |
| 0.8618055555555556 | 0 |
| 0.8624999999999999 | 0 |
| 0.8631944444444444 | 0 |
| 0.8638888888888889 | 0 |
| 0.8645833333333334 | 0 |
| 0.8652777777777777 | 0 |
| 0.8659722222222223 | 0 |
| 0.8666666666666667 | 0 |
| 0.8673611111111111 | 0 |
| 0.8680555555555555 | 0 |
| 0.86875 | 0 |
| 0.8694444444444445 | 0 |
| 0.8701388888888889 | 0 |
| 0.8708333333333332 | 0 |
| 0.8715277777777778 | 0 |
| 0.8722222222222222 | 0 |
| 0.8729166666666667 | 0 |
| 0.873611111111111 | 0 |
| 0.8743055555555556 | 0 |
| 0.875 | 0 |
| 0.8756944444444444 | 0 |
| 0.876388888888889 | 0 |
| 0.8770833333333333 | 0 |
| 0.8777777777777778 | 0 |
| 0.8784722222222222 | 0 |
| 0.8791666666666668 | 0 |
| 0.8798611111111111 | 0 |
| 0.8805555555555555 | 0 |
| 0.88125 | 0 |
| 0.8819444444444445 | 0 |
| 0.8826388888888889 | 0 |
| 0.8833333333333333 | 0 |
| 0.8840277777777777 | 0 |
| 0.8847222222222223 | 0 |
| 0.8854166666666666 | 0 |
| 0.8861111111111111 | 0 |
| 0.8868055555555556 | 0 |
| 0.8875000000000001 | 0 |
| 0.8881944444444444 | 0 |
| 0.8888888888888888 | 0 |
| 0.8895833333333334 | 0 |
| 0.8902777777777778 | 0 |
| 0.8909722222222222 | 0 |
| 0.8916666666666666 | 0 |
| 0.8923611111111112 | 0 |
| 0.8930555555555556 | 0 |
| 0.8937499999999999 | 0 |
| 0.8944444444444444 | 0 |
| 0.8951388888888889 | 0 |
| 0.8958333333333334 | 0 |
| 0.8965277777777777 | 0 |
| 0.8972222222222223 | 0 |
| 0.8979166666666667 | 0 |
| 0.8986111111111111 | 0 |
| 0.8993055555555555 | 0 |
| 0.9 | 0 |
| 0.9006944444444445 | 0 |
| 0.9013888888888889 | 0 |
| 0.9020833333333332 | 0 |
| 0.9027777777777778 | 0 |
| 0.9034722222222222 | 0 |
| 0.9041666666666667 | 0 |
| 0.904861111111111 | 0 |
| 0.9055555555555556 | 0 |
| 0.90625 | 0 |
| 0.9069444444444444 | 0 |
| 0.907638888888889 | 0 |
| 0.9083333333333333 | 0 |
| 0.9090277777777778 | 0 |
| 0.9097222222222222 | 0 |
| 0.9104166666666668 | 0 |
| 0.9111111111111111 | 0 |
| 0.9118055555555555 | 0 |
| 0.9125 | 0 |
| 0.9131944444444445 | 0 |
| 0.9138888888888889 | 0 |
| 0.9145833333333333 | 0 |
| 0.9152777777777777 | 0 |
| 0.9159722222222223 | 0 |
| 0.9166666666666666 | 0 |
| 0.9173611111111111 | 0 |
| 0.9180555555555556 | 0 |
| 0.9187500000000001 | 0 |
| 0.9194444444444444 | 0 |
| 0.9201388888888888 | 0 |
| 0.9208333333333334 | 0 |
| 0.9215277777777778 | 0 |
| 0.9222222222222222 | 0 |
| 0.9229166666666666 | 0 |
| 0.9236111111111112 | 0 |
| 0.9243055555555556 | 0 |
| 0.9249999999999999 | 0 |
| 0.9256944444444444 | 0 |
| 0.9263888888888889 | 0 |
| 0.9270833333333334 | 0 |
| 0.9277777777777777 | 0 |
| 0.9284722222222223 | 0 |
| 0.9291666666666667 | 0 |
| 0.9298611111111111 | 0 |
| 0.9305555555555555 | 0 |
| 0.93125 | 0 |
| 0.9319444444444445 | 0 |
| 0.9326388888888889 | 0 |
| 0.9333333333333332 | 0 |
| 0.9340277777777778 | 0 |
| 0.9347222222222222 | 0 |
| 0.9354166666666667 | 0 |
| 0.936111111111111 | 0 |
| 0.9368055555555556 | 0 |
| 0.9375 | 0 |
| 0.9381944444444444 | 0 |
| 0.938888888888889 | 0 |
| 0.9395833333333333 | 0 |
| 0.9402777777777778 | 0 |
| 0.9409722222222222 | 0 |
| 0.9416666666666668 | 0 |
| 0.9423611111111111 | 0 |
| 0.9430555555555555 | 0 |
| 0.94375 | 0 |
| 0.9444444444444445 | 0 |
| 0.9451388888888889 | 0 |
| 0.9458333333333333 | 0 |
| 0.9465277777777777 | 0 |
| 0.9472222222222223 | 0 |
| 0.9479166666666666 | 0 |
| 0.9486111111111111 | 0 |
| 0.9493055555555556 | 0 |
| 0.9500000000000001 | 0 |
| 0.9506944444444444 | 0 |
| 0.9513888888888888 | 0 |
| 0.9520833333333334 | 0 |
| 0.9527777777777778 | 0 |
| 0.9534722222222222 | 0 |
| 0.9541666666666666 | 0 |
| 0.9548611111111112 | 0 |
| 0.9555555555555556 | 0 |
| 0.9562499999999999 | 0 |
| 0.9569444444444444 | 0 |
| 0.9576388888888889 | 0 |
| 0.9583333333333334 | 0 |
| 0.9590277777777777 | 0 |
| 0.9597222222222223 | 0 |
| 0.9604166666666667 | 0 |
| 0.9611111111111111 | 0 |
| 0.9618055555555555 | 0 |
| 0.9625 | 0 |
| 0.9631944444444445 | 0 |
| 0.9638888888888889 | 0 |
| 0.9645833333333332 | 0 |
| 0.9652777777777778 | 0 |
| 0.9659722222222222 | 0 |
| 0.9666666666666667 | 0 |
| 0.967361111111111 | 0 |
| 0.9680555555555556 | 0 |
| 0.96875 | 0 |
| 0.9694444444444444 | 0 |
| 0.970138888888889 | 0 |
| 0.9708333333333333 | 0 |
| 0.9715277777777778 | 0 |
| 0.9722222222222222 | 0 |
| 0.9729166666666668 | 0 |
| 0.9736111111111111 | 0 |
| 0.9743055555555555 | 0 |
| 0.975 | 0 |
| 0.9756944444444445 | 0 |
| 0.9763888888888889 | 0 |
| 0.9770833333333333 | 0 |
| 0.9777777777777777 | 0 |
| 0.9784722222222223 | 0 |
| 0.9791666666666666 | 0 |
| 0.9798611111111111 | 0 |
| 0.9805555555555556 | 0 |
| 0.9812500000000001 | 0 |
| 0.9819444444444444 | 0 |
| 0.9826388888888888 | 0 |
| 0.9833333333333334 | 0 |
| 0.9840277777777778 | 0 |
| 0.9847222222222222 | 0 |
| 0.9854166666666666 | 0 |
| 0.9861111111111112 | 0 |
| 0.9868055555555556 | 0 |
| 0.9874999999999999 | 0 |
| 0.9881944444444444 | 0 |
| 0.9888888888888889 | 0 |
| 0.9895833333333334 | 0 |
| 0.9902777777777777 | 0 |
| 0.9909722222222223 | 0 |
| 0.9916666666666667 | 0 |
| 0.9923611111111111 | 0 |
| 0.9930555555555555 | 0 |
| 0.99375 | 0 |
| 0.9944444444444445 | 0 |
| 0.9951388888888889 | 0 |
| 0.9958333333333332 | 0 |
| 0.9965277777777778 | 0 |
| 0.9972222222222222 | 0 |
| 0.9979166666666667 | 0 |
| 0.998611111111111 | 0 |
| 0.9993055555555556 | 0 |